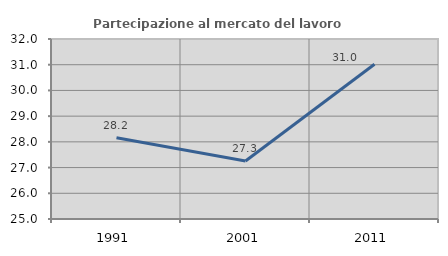
| Category | Partecipazione al mercato del lavoro  femminile |
|---|---|
| 1991.0 | 28.16 |
| 2001.0 | 27.253 |
| 2011.0 | 31.02 |